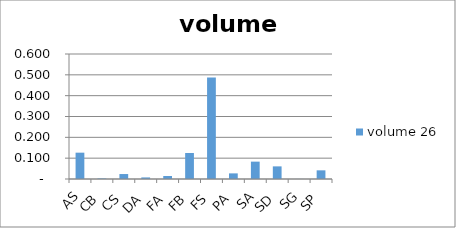
| Category |  volume 26  |
|---|---|
| AS | 0.126 |
| CB | 0.002 |
| CS | 0.024 |
| DA | 0.008 |
| FA | 0.014 |
| FB | 0.125 |
| FS | 0.488 |
| PA | 0.027 |
| SA | 0.083 |
| SD | 0.061 |
| SG | 0 |
| SP | 0.042 |